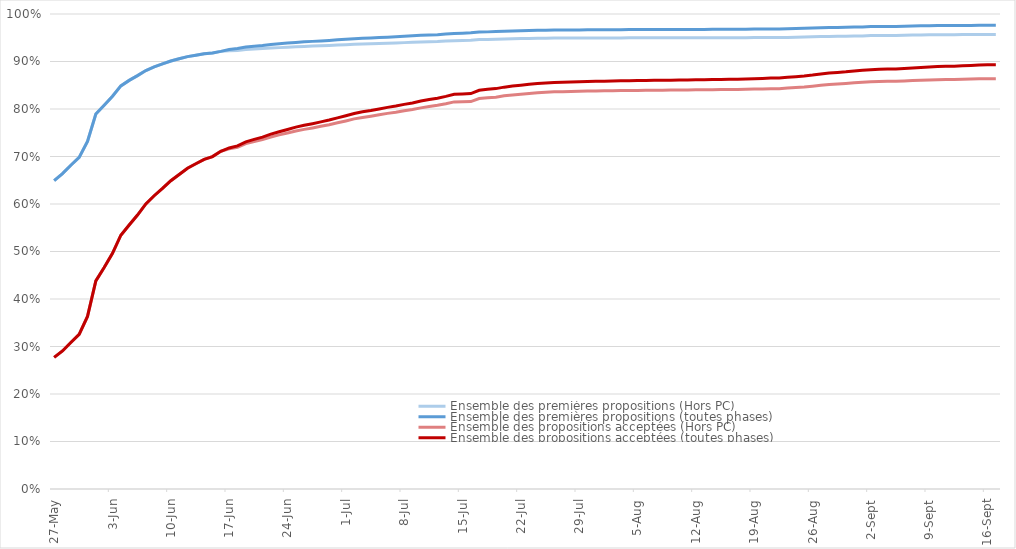
| Category | Ensemble des premières propositions (Hors PC) | Ensemble des premières propositions (toutes phases) | Ensemble des propositions acceptées (Hors PC) | Ensemble des propositions acceptées (toutes phases) |
|---|---|---|---|---|
| 2021-05-27 | 0.649 | 0.649 | 0.277 | 0.277 |
| 2021-05-28 | 0.664 | 0.664 | 0.291 | 0.291 |
| 2021-05-29 | 0.682 | 0.682 | 0.308 | 0.308 |
| 2021-05-30 | 0.698 | 0.698 | 0.326 | 0.326 |
| 2021-05-31 | 0.732 | 0.732 | 0.363 | 0.363 |
| 2021-06-01 | 0.789 | 0.789 | 0.438 | 0.438 |
| 2021-06-02 | 0.808 | 0.808 | 0.466 | 0.466 |
| 2021-06-03 | 0.827 | 0.827 | 0.496 | 0.496 |
| 2021-06-04 | 0.849 | 0.849 | 0.534 | 0.534 |
| 2021-06-05 | 0.86 | 0.86 | 0.556 | 0.556 |
| 2021-06-06 | 0.87 | 0.87 | 0.577 | 0.577 |
| 2021-06-07 | 0.881 | 0.881 | 0.6 | 0.6 |
| 2021-06-08 | 0.889 | 0.889 | 0.617 | 0.617 |
| 2021-06-09 | 0.895 | 0.895 | 0.633 | 0.633 |
| 2021-06-10 | 0.901 | 0.901 | 0.649 | 0.649 |
| 2021-06-11 | 0.906 | 0.906 | 0.662 | 0.662 |
| 2021-06-12 | 0.91 | 0.91 | 0.675 | 0.675 |
| 2021-06-13 | 0.913 | 0.913 | 0.685 | 0.685 |
| 2021-06-14 | 0.916 | 0.916 | 0.694 | 0.694 |
| 2021-06-15 | 0.918 | 0.918 | 0.7 | 0.7 |
| 2021-06-16 | 0.921 | 0.921 | 0.711 | 0.711 |
| 2021-06-17 | 0.923 | 0.925 | 0.716 | 0.718 |
| 2021-06-18 | 0.923 | 0.927 | 0.719 | 0.722 |
| 2021-06-19 | 0.925 | 0.931 | 0.727 | 0.731 |
| 2021-06-20 | 0.926 | 0.932 | 0.732 | 0.736 |
| 2021-06-21 | 0.927 | 0.934 | 0.736 | 0.741 |
| 2021-06-22 | 0.928 | 0.936 | 0.741 | 0.747 |
| 2021-06-23 | 0.929 | 0.937 | 0.745 | 0.752 |
| 2021-06-24 | 0.93 | 0.939 | 0.749 | 0.757 |
| 2021-06-25 | 0.931 | 0.94 | 0.754 | 0.762 |
| 2021-06-26 | 0.932 | 0.941 | 0.757 | 0.766 |
| 2021-06-27 | 0.932 | 0.942 | 0.76 | 0.769 |
| 2021-06-28 | 0.933 | 0.943 | 0.764 | 0.773 |
| 2021-06-29 | 0.934 | 0.944 | 0.767 | 0.777 |
| 2021-06-30 | 0.935 | 0.946 | 0.771 | 0.781 |
| 2021-07-01 | 0.935 | 0.947 | 0.775 | 0.786 |
| 2021-07-02 | 0.936 | 0.948 | 0.779 | 0.791 |
| 2021-07-03 | 0.937 | 0.949 | 0.782 | 0.794 |
| 2021-07-04 | 0.937 | 0.95 | 0.785 | 0.797 |
| 2021-07-05 | 0.938 | 0.95 | 0.788 | 0.8 |
| 2021-07-06 | 0.938 | 0.951 | 0.791 | 0.803 |
| 2021-07-07 | 0.939 | 0.952 | 0.793 | 0.806 |
| 2021-07-08 | 0.94 | 0.953 | 0.796 | 0.81 |
| 2021-07-09 | 0.94 | 0.954 | 0.799 | 0.813 |
| 2021-07-10 | 0.941 | 0.955 | 0.802 | 0.817 |
| 2021-07-11 | 0.942 | 0.956 | 0.805 | 0.82 |
| 2021-07-12 | 0.942 | 0.956 | 0.808 | 0.823 |
| 2021-07-13 | 0.943 | 0.958 | 0.811 | 0.827 |
| 2021-07-14 | 0.944 | 0.959 | 0.815 | 0.831 |
| 2021-07-15 | 0.944 | 0.959 | 0.815 | 0.832 |
| 2021-07-16 | 0.945 | 0.96 | 0.816 | 0.833 |
| 2021-07-17 | 0.946 | 0.962 | 0.822 | 0.839 |
| 2021-07-18 | 0.947 | 0.962 | 0.824 | 0.841 |
| 2021-07-19 | 0.947 | 0.963 | 0.825 | 0.843 |
| 2021-07-20 | 0.947 | 0.964 | 0.828 | 0.846 |
| 2021-07-21 | 0.948 | 0.964 | 0.83 | 0.848 |
| 2021-07-22 | 0.948 | 0.965 | 0.831 | 0.85 |
| 2021-07-23 | 0.949 | 0.965 | 0.833 | 0.852 |
| 2021-07-24 | 0.949 | 0.966 | 0.834 | 0.853 |
| 2021-07-25 | 0.949 | 0.966 | 0.835 | 0.855 |
| 2021-07-26 | 0.949 | 0.966 | 0.836 | 0.856 |
| 2021-07-27 | 0.949 | 0.966 | 0.837 | 0.856 |
| 2021-07-28 | 0.949 | 0.966 | 0.837 | 0.857 |
| 2021-07-29 | 0.95 | 0.967 | 0.837 | 0.857 |
| 2021-07-30 | 0.95 | 0.967 | 0.838 | 0.858 |
| 2021-07-31 | 0.95 | 0.967 | 0.838 | 0.858 |
| 2021-08-01 | 0.95 | 0.967 | 0.838 | 0.859 |
| 2021-08-02 | 0.95 | 0.967 | 0.838 | 0.859 |
| 2021-08-03 | 0.95 | 0.967 | 0.839 | 0.859 |
| 2021-08-04 | 0.95 | 0.967 | 0.839 | 0.86 |
| 2021-08-05 | 0.95 | 0.967 | 0.839 | 0.86 |
| 2021-08-06 | 0.95 | 0.967 | 0.839 | 0.86 |
| 2021-08-07 | 0.95 | 0.967 | 0.84 | 0.86 |
| 2021-08-08 | 0.95 | 0.967 | 0.84 | 0.861 |
| 2021-08-09 | 0.95 | 0.967 | 0.84 | 0.861 |
| 2021-08-10 | 0.95 | 0.967 | 0.84 | 0.861 |
| 2021-08-11 | 0.95 | 0.968 | 0.84 | 0.861 |
| 2021-08-12 | 0.95 | 0.968 | 0.84 | 0.861 |
| 2021-08-13 | 0.95 | 0.968 | 0.84 | 0.862 |
| 2021-08-14 | 0.95 | 0.968 | 0.841 | 0.862 |
| 2021-08-15 | 0.95 | 0.968 | 0.841 | 0.862 |
| 2021-08-16 | 0.95 | 0.968 | 0.841 | 0.862 |
| 2021-08-17 | 0.95 | 0.968 | 0.841 | 0.863 |
| 2021-08-18 | 0.95 | 0.968 | 0.842 | 0.863 |
| 2021-08-19 | 0.95 | 0.968 | 0.842 | 0.864 |
| 2021-08-20 | 0.95 | 0.968 | 0.842 | 0.864 |
| 2021-08-21 | 0.95 | 0.969 | 0.843 | 0.865 |
| 2021-08-22 | 0.95 | 0.969 | 0.843 | 0.865 |
| 2021-08-23 | 0.951 | 0.969 | 0.844 | 0.867 |
| 2021-08-24 | 0.951 | 0.969 | 0.845 | 0.868 |
| 2021-08-25 | 0.951 | 0.97 | 0.846 | 0.869 |
| 2021-08-26 | 0.952 | 0.97 | 0.848 | 0.871 |
| 2021-08-27 | 0.953 | 0.971 | 0.85 | 0.874 |
| 2021-08-28 | 0.953 | 0.971 | 0.852 | 0.876 |
| 2021-08-29 | 0.953 | 0.972 | 0.853 | 0.877 |
| 2021-08-30 | 0.953 | 0.972 | 0.854 | 0.878 |
| 2021-08-31 | 0.954 | 0.972 | 0.855 | 0.88 |
| 2021-09-01 | 0.954 | 0.973 | 0.857 | 0.881 |
| 2021-09-02 | 0.955 | 0.973 | 0.857 | 0.883 |
| 2021-09-03 | 0.955 | 0.974 | 0.858 | 0.884 |
| 2021-09-04 | 0.955 | 0.974 | 0.858 | 0.884 |
| 2021-09-05 | 0.955 | 0.974 | 0.858 | 0.884 |
| 2021-09-06 | 0.955 | 0.974 | 0.859 | 0.885 |
| 2021-09-07 | 0.956 | 0.975 | 0.86 | 0.886 |
| 2021-09-08 | 0.956 | 0.975 | 0.861 | 0.887 |
| 2021-09-09 | 0.956 | 0.975 | 0.861 | 0.888 |
| 2021-09-10 | 0.956 | 0.976 | 0.862 | 0.889 |
| 2021-09-11 | 0.956 | 0.976 | 0.862 | 0.89 |
| 2021-09-12 | 0.956 | 0.976 | 0.862 | 0.89 |
| 2021-09-13 | 0.957 | 0.976 | 0.863 | 0.891 |
| 2021-09-14 | 0.957 | 0.976 | 0.863 | 0.892 |
| 2021-09-15 | 0.957 | 0.976 | 0.864 | 0.893 |
| 2021-09-16 | 0.957 | 0.976 | 0.864 | 0.893 |
| 2021-09-17 | 0.957 | 0.976 | 0.864 | 0.893 |